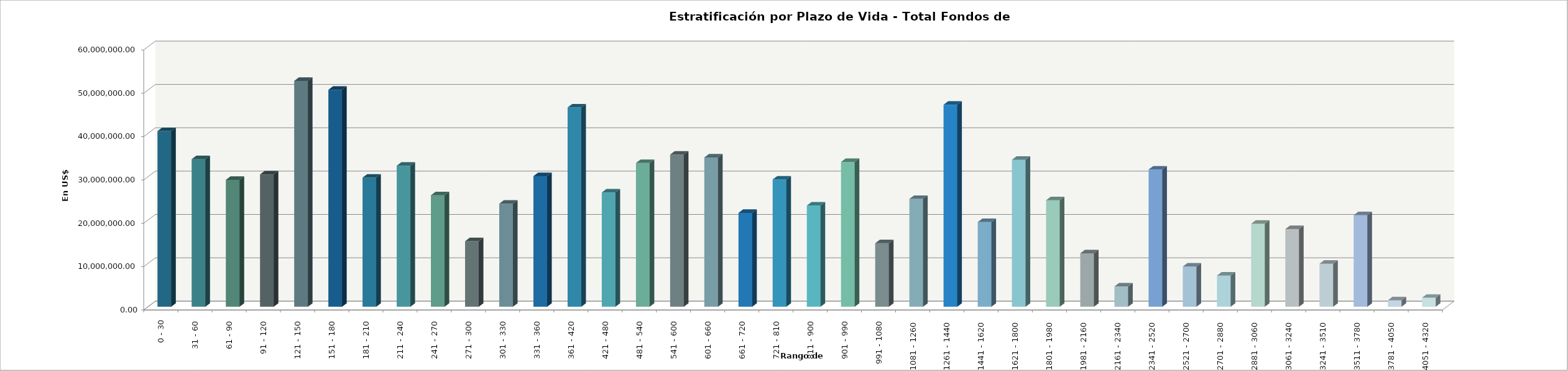
| Category | Series 0 |
|---|---|
| 0 - 30 | 40538033.91 |
| 31 - 60 | 34054557.63 |
| 61 - 90 | 29280797.3 |
| 91 - 120 | 30531669.4 |
| 121 - 150 | 52124465.26 |
| 151 - 180 | 50067843.79 |
| 181 - 210 | 29797506.6 |
| 211 - 240 | 32556489.82 |
| 241 - 270 | 25732312.67 |
| 271 - 300 | 15127615.42 |
| 301 - 330 | 23773999.92 |
| 331 - 360 | 30152499.07 |
| 361 - 420 | 45990041.18 |
| 421 - 480 | 26371853 |
| 481 - 540 | 33180109.69 |
| 541 - 600 | 35115051.11 |
| 601 - 660 | 34460476.8 |
| 661 - 720 | 21670087.7 |
| 721 - 810 | 29370345.99 |
| 811 - 900 | 23359387.9 |
| 901 - 990 | 33409454.37 |
| 991 - 1080 | 14677415.61 |
| 1081 - 1260 | 24883558.6 |
| 1261 - 1440 | 46616374.87 |
| 1441 - 1620 | 19542827.73 |
| 1621 - 1800 | 33912042.78 |
| 1801 - 1980 | 24577480.01 |
| 1981 - 2160 | 12335285.49 |
| 2161 - 2340 | 4672794.04 |
| 2341 - 2520 | 31667007.58 |
| 2521 - 2700 | 9282022.16 |
| 2701 - 2880 | 7201284.46 |
| 2881 - 3060 | 19141574.36 |
| 3061 - 3240 | 17935177.38 |
| 3241 - 3510 | 9920431.23 |
| 3511 - 3780 | 21134454.53 |
| 3781 - 4050 | 1502157.95 |
| 4051 - 4320 | 2080388.5 |